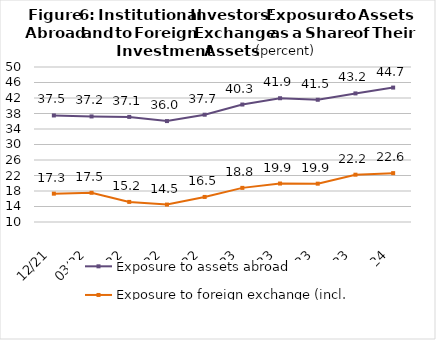
| Category | Exposure to assets abroad | Exposure to foreign exchange (incl. derivatives) |
|---|---|---|
| 2021-12-31 | 37.497 | 17.314 |
| 2022-03-31 | 37.241 | 17.538 |
| 2022-06-30 | 37.122 | 15.186 |
| 2022-09-30 | 36.045 | 14.495 |
| 2022-12-31 | 37.687 | 16.465 |
| 2023-03-31 | 40.315 | 18.806 |
| 2023-06-30 | 41.942 | 19.926 |
| 2023-09-30 | 41.546 | 19.891 |
| 2023-12-31 | 43.183 | 22.207 |
| 2024-03-31 | 44.688 | 22.611 |